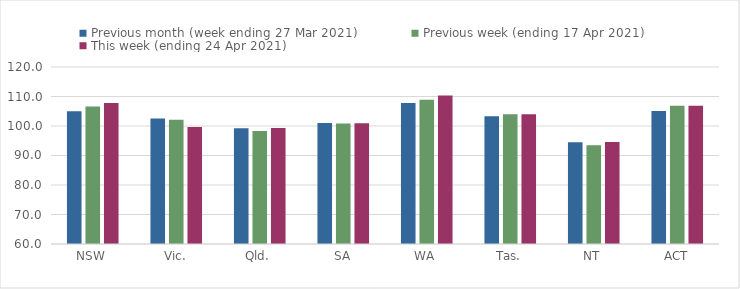
| Category | Previous month (week ending 27 Mar 2021) | Previous week (ending 17 Apr 2021) | This week (ending 24 Apr 2021) |
|---|---|---|---|
| NSW | 104.98 | 106.63 | 107.82 |
| Vic. | 102.54 | 102.16 | 99.62 |
| Qld. | 99.26 | 98.34 | 99.35 |
| SA | 100.99 | 100.88 | 100.94 |
| WA | 107.8 | 108.91 | 110.31 |
| Tas. | 103.28 | 104 | 104 |
| NT | 94.47 | 93.47 | 94.57 |
| ACT | 105.07 | 106.88 | 106.88 |